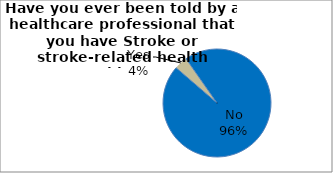
| Category | Series 0 |
|---|---|
| No | 96.044 |
| Yes | 3.956 |